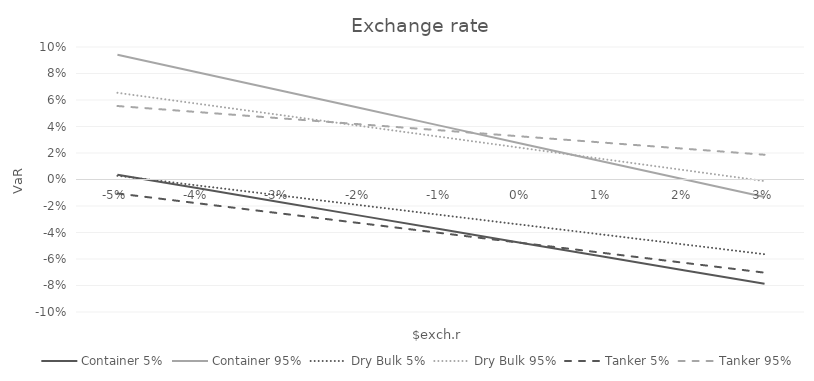
| Category | Container 5% | Container 95% | Dry Bulk 5% | Dry Bulk 95% | Tanker 5% | Tanker 95% |
|---|---|---|---|---|---|---|
| -0.05 | 0.004 | 0.094 | 0.003 | 0.065 | -0.011 | 0.055 |
| -0.04 | -0.007 | 0.081 | -0.005 | 0.057 | -0.018 | 0.051 |
| -0.03 | -0.017 | 0.067 | -0.012 | 0.049 | -0.025 | 0.046 |
| -0.019999999999999997 | -0.027 | 0.054 | -0.019 | 0.04 | -0.033 | 0.042 |
| -0.009999999999999997 | -0.038 | 0.04 | -0.027 | 0.032 | -0.04 | 0.037 |
| 0.0 | -0.048 | 0.027 | -0.034 | 0.024 | -0.048 | 0.032 |
| 0.01 | -0.058 | 0.014 | -0.042 | 0.015 | -0.055 | 0.028 |
| 0.02 | -0.068 | 0 | -0.049 | 0.007 | -0.063 | 0.023 |
| 0.03 | -0.079 | -0.013 | -0.056 | -0.001 | -0.07 | 0.019 |